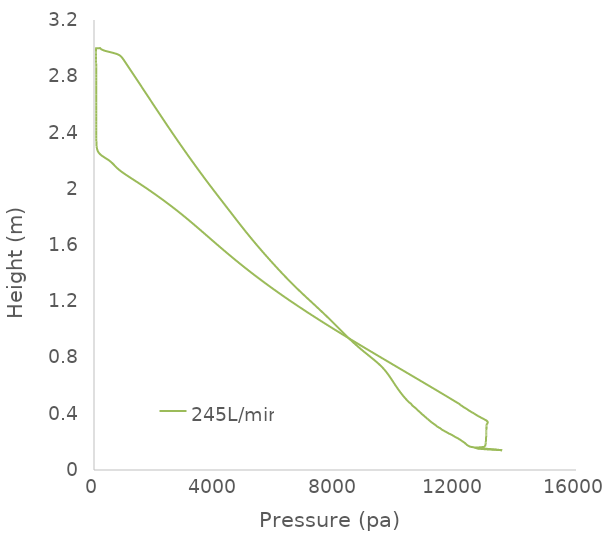
| Category | 245L/min |
|---|---|
| 13547.5 | 0.14 |
| 13414.4 | 0.144 |
| 13353.0 | 0.145 |
| 13295.0 | 0.146 |
| 13213.6 | 0.148 |
| 13187.0 | 0.148 |
| 13053.4 | 0.15 |
| 12757.8 | 0.155 |
| 12636.1 | 0.16 |
| 12604.9 | 0.161 |
| 12556.3 | 0.163 |
| 12500.2 | 0.165 |
| 12489.1 | 0.165 |
| 12440.3 | 0.171 |
| 12428.9 | 0.172 |
| 12397.9 | 0.176 |
| 12372.7 | 0.179 |
| 12365.8 | 0.181 |
| 12364.8 | 0.181 |
| 12363.4 | 0.181 |
| 12361.2 | 0.182 |
| 12357.9 | 0.182 |
| 12354.2 | 0.183 |
| 12346.4 | 0.185 |
| 12313.6 | 0.192 |
| 12302.8 | 0.194 |
| 12254.5 | 0.2 |
| 12253.1 | 0.201 |
| 12250.0 | 0.201 |
| 12248.1 | 0.201 |
| 12246.0 | 0.202 |
| 12243.4 | 0.202 |
| 12171.5 | 0.213 |
| 12168.9 | 0.213 |
| 12165.6 | 0.214 |
| 12161.5 | 0.214 |
| 12158.4 | 0.215 |
| 12086.9 | 0.224 |
| 12082.8 | 0.225 |
| 12079.6 | 0.225 |
| 12074.5 | 0.226 |
| 12065.8 | 0.227 |
| 12043.0 | 0.229 |
| 12036.1 | 0.23 |
| 11975.5 | 0.237 |
| 11961.4 | 0.239 |
| 11937.6 | 0.242 |
| 11881.0 | 0.249 |
| 11879.7 | 0.25 |
| 11874.6 | 0.25 |
| 11864.5 | 0.251 |
| 11864.1 | 0.251 |
| 11855.6 | 0.252 |
| 11854.8 | 0.252 |
| 11854.5 | 0.252 |
| 11787.1 | 0.259 |
| 11784.0 | 0.259 |
| 11734.8 | 0.265 |
| 11731.2 | 0.265 |
| 11727.2 | 0.266 |
| 11725.5 | 0.266 |
| 11668.2 | 0.273 |
| 11655.8 | 0.274 |
| 11655.7 | 0.274 |
| 11654.7 | 0.275 |
| 11649.2 | 0.275 |
| 11648.6 | 0.275 |
| 11617.5 | 0.279 |
| 11573.3 | 0.284 |
| 11566.2 | 0.285 |
| 11559.8 | 0.286 |
| 11554.8 | 0.286 |
| 11513.0 | 0.293 |
| 11496.3 | 0.296 |
| 11496.1 | 0.296 |
| 11495.5 | 0.296 |
| 11493.0 | 0.297 |
| 11486.1 | 0.298 |
| 11481.6 | 0.298 |
| 11447.3 | 0.302 |
| 11411.1 | 0.307 |
| 11404.6 | 0.308 |
| 11400.7 | 0.308 |
| 11398.9 | 0.308 |
| 11394.2 | 0.309 |
| 11382.8 | 0.311 |
| 11381.8 | 0.311 |
| 11375.2 | 0.312 |
| 11323.6 | 0.321 |
| 11317.1 | 0.322 |
| 11313.0 | 0.323 |
| 11272.1 | 0.329 |
| 11266.6 | 0.33 |
| 11258.6 | 0.331 |
| 11252.1 | 0.332 |
| 11249.3 | 0.333 |
| 11245.1 | 0.333 |
| 11243.8 | 0.333 |
| 11193.5 | 0.341 |
| 11190.3 | 0.342 |
| 11181.6 | 0.343 |
| 11173.3 | 0.345 |
| 11154.5 | 0.348 |
| 11154.5 | 0.348 |
| 11154.3 | 0.348 |
| 11154.0 | 0.348 |
| 11146.8 | 0.35 |
| 11139.7 | 0.351 |
| 11120.4 | 0.355 |
| 11119.5 | 0.355 |
| 11098.4 | 0.359 |
| 11090.4 | 0.36 |
| 11089.4 | 0.36 |
| 11086.3 | 0.361 |
| 11080.7 | 0.362 |
| 11075.2 | 0.363 |
| 11034.6 | 0.37 |
| 11030.5 | 0.371 |
| 11024.8 | 0.372 |
| 11012.7 | 0.374 |
| 10988.7 | 0.379 |
| 10984.2 | 0.38 |
| 10976.5 | 0.381 |
| 10940.7 | 0.388 |
| 10940.2 | 0.388 |
| 10934.9 | 0.389 |
| 10932.9 | 0.389 |
| 10930.7 | 0.39 |
| 10920.6 | 0.392 |
| 10908.5 | 0.394 |
| 10880.6 | 0.398 |
| 10872.2 | 0.401 |
| 10871.3 | 0.401 |
| 10870.6 | 0.401 |
| 10822.3 | 0.411 |
| 10819.4 | 0.412 |
| 10818.3 | 0.412 |
| 10813.2 | 0.413 |
| 10812.8 | 0.413 |
| 10811.9 | 0.413 |
| 10783.3 | 0.418 |
| 10752.2 | 0.423 |
| 10750.9 | 0.424 |
| 10747.9 | 0.424 |
| 10746.1 | 0.425 |
| 10710.7 | 0.433 |
| 10695.1 | 0.436 |
| 10693.9 | 0.437 |
| 10690.3 | 0.437 |
| 10660.9 | 0.442 |
| 10632.6 | 0.447 |
| 10632.0 | 0.447 |
| 10631.7 | 0.447 |
| 10630.0 | 0.448 |
| 10627.9 | 0.448 |
| 10626.4 | 0.448 |
| 10622.0 | 0.449 |
| 10615.8 | 0.45 |
| 10579.6 | 0.456 |
| 10577.4 | 0.457 |
| 10575.2 | 0.457 |
| 10561.9 | 0.46 |
| 10543.5 | 0.465 |
| 10543.1 | 0.465 |
| 10529.8 | 0.47 |
| 10529.6 | 0.47 |
| 10529.4 | 0.47 |
| 10529.3 | 0.47 |
| 10466.2 | 0.48 |
| 10416.4 | 0.491 |
| 10369.6 | 0.501 |
| 10326.0 | 0.511 |
| 10284.3 | 0.522 |
| 10243.8 | 0.532 |
| 10206.1 | 0.542 |
| 10169.3 | 0.553 |
| 10133.5 | 0.563 |
| 10098.7 | 0.574 |
| 10064.8 | 0.584 |
| 10031.8 | 0.594 |
| 9999.28 | 0.605 |
| 9967.27 | 0.615 |
| 9935.43 | 0.625 |
| 9903.63 | 0.636 |
| 9871.8 | 0.646 |
| 9839.4 | 0.656 |
| 9806.45 | 0.667 |
| 9772.45 | 0.677 |
| 9737.07 | 0.687 |
| 9700.24 | 0.698 |
| 9660.42 | 0.708 |
| 9618.88 | 0.718 |
| 9574.9 | 0.729 |
| 9527.21 | 0.739 |
| 9476.91 | 0.75 |
| 9424.13 | 0.76 |
| 9369.03 | 0.77 |
| 9311.71 | 0.781 |
| 9252.79 | 0.791 |
| 9193.19 | 0.801 |
| 9133.22 | 0.812 |
| 9073.15 | 0.822 |
| 9013.35 | 0.832 |
| 8954.16 | 0.843 |
| 8895.81 | 0.853 |
| 8838.42 | 0.863 |
| 8782.17 | 0.874 |
| 8726.7 | 0.884 |
| 8671.78 | 0.894 |
| 8618.24 | 0.905 |
| 8566.13 | 0.915 |
| 8514.53 | 0.926 |
| 8463.25 | 0.936 |
| 8412.74 | 0.946 |
| 8363.07 | 0.957 |
| 8314.49 | 0.967 |
| 8266.1 | 0.977 |
| 8217.42 | 0.988 |
| 8169.35 | 0.998 |
| 8121.76 | 1.008 |
| 8073.94 | 1.019 |
| 8025.65 | 1.029 |
| 7977.75 | 1.039 |
| 7929.41 | 1.05 |
| 7880.61 | 1.06 |
| 7831.87 | 1.07 |
| 7782.49 | 1.081 |
| 7732.23 | 1.091 |
| 7682.13 | 1.102 |
| 7631.61 | 1.112 |
| 7580.31 | 1.122 |
| 7529.04 | 1.133 |
| 7477.49 | 1.143 |
| 7425.57 | 1.153 |
| 7373.7 | 1.164 |
| 7321.92 | 1.174 |
| 7269.42 | 1.184 |
| 7217.39 | 1.195 |
| 7165.34 | 1.205 |
| 7112.44 | 1.215 |
| 7060.01 | 1.226 |
| 7008.47 | 1.236 |
| 6956.96 | 1.246 |
| 6905.59 | 1.257 |
| 6854.97 | 1.267 |
| 6804.42 | 1.278 |
| 6754.0 | 1.288 |
| 6704.6 | 1.298 |
| 6655.33 | 1.309 |
| 6606.24 | 1.319 |
| 6558.07 | 1.329 |
| 6510.33 | 1.34 |
| 6462.9 | 1.35 |
| 6415.62 | 1.36 |
| 6368.86 | 1.371 |
| 6322.64 | 1.381 |
| 6276.65 | 1.391 |
| 6231.05 | 1.402 |
| 6185.83 | 1.412 |
| 6140.66 | 1.422 |
| 6095.71 | 1.433 |
| 6051.27 | 1.443 |
| 6007.09 | 1.454 |
| 5963.05 | 1.464 |
| 5919.13 | 1.474 |
| 5875.49 | 1.485 |
| 5832.1 | 1.495 |
| 5788.92 | 1.505 |
| 5745.82 | 1.516 |
| 5702.85 | 1.526 |
| 5660.18 | 1.536 |
| 5617.95 | 1.547 |
| 5575.78 | 1.557 |
| 5533.79 | 1.567 |
| 5492.43 | 1.578 |
| 5450.86 | 1.588 |
| 5409.69 | 1.598 |
| 5369.04 | 1.609 |
| 5328.25 | 1.619 |
| 5287.98 | 1.63 |
| 5247.91 | 1.64 |
| 5207.91 | 1.65 |
| 5168.32 | 1.661 |
| 5128.78 | 1.671 |
| 5089.33 | 1.681 |
| 5050.22 | 1.692 |
| 5011.4 | 1.702 |
| 4971.1 | 1.713 |
| 4928.83 | 1.724 |
| 4885.3 | 1.736 |
| 4842.49 | 1.748 |
| 4802.37 | 1.759 |
| 4764.92 | 1.769 |
| 4727.32 | 1.779 |
| 4689.94 | 1.79 |
| 4652.73 | 1.8 |
| 4615.33 | 1.81 |
| 4577.98 | 1.821 |
| 4540.62 | 1.831 |
| 4503.17 | 1.842 |
| 4465.77 | 1.852 |
| 4428.42 | 1.862 |
| 4391.06 | 1.873 |
| 4353.84 | 1.883 |
| 4316.57 | 1.893 |
| 4279.14 | 1.904 |
| 4241.85 | 1.914 |
| 4204.44 | 1.924 |
| 4167.01 | 1.935 |
| 4129.82 | 1.945 |
| 4092.73 | 1.955 |
| 4055.58 | 1.966 |
| 4018.4 | 1.976 |
| 3981.47 | 1.986 |
| 3944.69 | 1.997 |
| 3907.88 | 2.007 |
| 3871.16 | 2.018 |
| 3834.61 | 2.028 |
| 3798.2 | 2.038 |
| 3762.03 | 2.049 |
| 3725.74 | 2.059 |
| 3689.47 | 2.069 |
| 3653.41 | 2.08 |
| 3617.54 | 2.09 |
| 3581.92 | 2.1 |
| 3546.3 | 2.111 |
| 3510.7 | 2.121 |
| 3475.16 | 2.131 |
| 3439.75 | 2.142 |
| 3404.54 | 2.152 |
| 3369.53 | 2.162 |
| 3334.63 | 2.173 |
| 3299.8 | 2.183 |
| 3265.02 | 2.194 |
| 3230.21 | 2.204 |
| 3195.51 | 2.214 |
| 3161.0 | 2.225 |
| 3126.67 | 2.235 |
| 3092.5 | 2.245 |
| 3058.35 | 2.256 |
| 3024.28 | 2.266 |
| 2990.28 | 2.276 |
| 2956.38 | 2.287 |
| 2922.59 | 2.297 |
| 2888.78 | 2.307 |
| 2855.09 | 2.318 |
| 2821.51 | 2.328 |
| 2788.05 | 2.338 |
| 2754.73 | 2.349 |
| 2721.5 | 2.359 |
| 2688.26 | 2.37 |
| 2655.07 | 2.38 |
| 2622.03 | 2.39 |
| 2589.1 | 2.401 |
| 2556.25 | 2.411 |
| 2523.49 | 2.421 |
| 2490.78 | 2.432 |
| 2458.1 | 2.442 |
| 2425.51 | 2.452 |
| 2392.97 | 2.463 |
| 2360.49 | 2.473 |
| 2328.09 | 2.483 |
| 2295.78 | 2.494 |
| 2263.48 | 2.504 |
| 2231.2 | 2.514 |
| 2199.0 | 2.525 |
| 2166.89 | 2.535 |
| 2134.77 | 2.546 |
| 2102.65 | 2.556 |
| 2070.59 | 2.566 |
| 2038.57 | 2.577 |
| 2006.58 | 2.587 |
| 1974.61 | 2.597 |
| 1942.65 | 2.608 |
| 1910.69 | 2.618 |
| 1878.71 | 2.628 |
| 1846.77 | 2.639 |
| 1814.82 | 2.649 |
| 1782.84 | 2.659 |
| 1750.91 | 2.67 |
| 1719.0 | 2.68 |
| 1687.1 | 2.69 |
| 1655.21 | 2.701 |
| 1623.28 | 2.711 |
| 1591.33 | 2.722 |
| 1559.38 | 2.732 |
| 1527.43 | 2.742 |
| 1495.47 | 2.753 |
| 1463.47 | 2.763 |
| 1431.42 | 2.773 |
| 1399.36 | 2.784 |
| 1367.29 | 2.794 |
| 1335.21 | 2.804 |
| 1303.12 | 2.815 |
| 1271.02 | 2.825 |
| 1238.86 | 2.835 |
| 1206.66 | 2.846 |
| 1174.44 | 2.856 |
| 1142.18 | 2.866 |
| 1109.86 | 2.877 |
| 1077.52 | 2.887 |
| 1045.12 | 2.898 |
| 1012.57 | 2.908 |
| 979.656 | 2.918 |
| 945.296 | 2.929 |
| 905.225 | 2.939 |
| 846.147 | 2.949 |
| 740.371 | 2.96 |
| 562.962 | 2.97 |
| 562.962 | 2.97 |
| 378.116 | 2.98 |
| 257.618 | 2.99 |
| 201.285 | 3 |
| 201.278 | 3 |
| 201.116 | 3 |
| 181.213 | 3 |
| 140.723 | 3 |
| 123.224 | 3 |
| 117.063 | 3 |
| 115.191 | 3 |
| 112.268 | 3 |
| 111.33 | 3 |
| 110.616 | 3 |
| 109.6 | 3 |
| 109.366 | 3 |
| 77.283 | 3 |
| 73.8377 | 3 |
| 73.3734 | 3 |
| 73.8986 | 3 |
| 74.4617 | 3 |
| 66.7462 | 3 |
| 66.7471 | 3 |
| 66.7667 | 3 |
| 66.7675 | 3 |
| 66.8082 | 3 |
| 66.8282 | 3 |
| 66.8282 | 3 |
| 66.8277 | 2.997 |
| 66.8044 | 2.988 |
| 66.7612 | 2.978 |
| 66.7984 | 2.969 |
| 67.1744 | 2.959 |
| 68.0473 | 2.95 |
| 68.9822 | 2.94 |
| 69.5549 | 2.93 |
| 69.9523 | 2.92 |
| 70.2553 | 2.91 |
| 70.4895 | 2.9 |
| 70.6645 | 2.89 |
| 70.8366 | 2.88 |
| 70.9951 | 2.87 |
| 71.1255 | 2.86 |
| 71.2571 | 2.85 |
| 71.5136 | 2.83 |
| 71.7687 | 2.811 |
| 72.0508 | 2.791 |
| 72.3596 | 2.771 |
| 72.6912 | 2.752 |
| 73.0553 | 2.732 |
| 73.4326 | 2.712 |
| 73.8242 | 2.692 |
| 74.2264 | 2.673 |
| 74.6071 | 2.653 |
| 74.9753 | 2.633 |
| 75.3392 | 2.614 |
| 75.6787 | 2.594 |
| 75.9956 | 2.574 |
| 76.304 | 2.555 |
| 76.5924 | 2.535 |
| 76.8501 | 2.515 |
| 77.0841 | 2.495 |
| 77.2866 | 2.476 |
| 77.4412 | 2.456 |
| 77.5289 | 2.436 |
| 77.5469 | 2.417 |
| 77.5498 | 2.397 |
| 77.6405 | 2.377 |
| 77.9773 | 2.358 |
| 78.9309 | 2.338 |
| 81.6062 | 2.318 |
| 88.8163 | 2.298 |
| 106.806 | 2.279 |
| 148.46 | 2.259 |
| 233.435 | 2.239 |
| 368.794 | 2.22 |
| 508.475 | 2.2 |
| 616.586 | 2.18 |
| 705.219 | 2.16 |
| 801.932 | 2.14 |
| 918.61 | 2.12 |
| 1051.24 | 2.101 |
| 1191.97 | 2.081 |
| 1335.35 | 2.061 |
| 1478.41 | 2.041 |
| 1619.27 | 2.021 |
| 1756.96 | 2.001 |
| 1891.66 | 1.981 |
| 2024.0 | 1.961 |
| 2154.19 | 1.941 |
| 2282.2 | 1.922 |
| 2407.95 | 1.902 |
| 2531.35 | 1.882 |
| 2652.28 | 1.862 |
| 2770.83 | 1.842 |
| 2887.16 | 1.822 |
| 3001.32 | 1.802 |
| 3113.58 | 1.782 |
| 3224.37 | 1.763 |
| 3333.85 | 1.743 |
| 3442.33 | 1.723 |
| 3549.9 | 1.703 |
| 3657.05 | 1.683 |
| 3764.01 | 1.663 |
| 3870.65 | 1.643 |
| 3977.67 | 1.623 |
| 4084.99 | 1.603 |
| 4192.79 | 1.584 |
| 4301.65 | 1.564 |
| 4411.42 | 1.544 |
| 4522.1 | 1.524 |
| 4634.01 | 1.504 |
| 4747.25 | 1.484 |
| 4861.86 | 1.464 |
| 4977.88 | 1.444 |
| 5095.42 | 1.424 |
| 5214.45 | 1.405 |
| 5334.97 | 1.385 |
| 5334.97 | 1.385 |
| 5457.32 | 1.365 |
| 5581.53 | 1.345 |
| 5707.22 | 1.325 |
| 5834.18 | 1.305 |
| 5962.86 | 1.285 |
| 6093.41 | 1.265 |
| 6225.47 | 1.246 |
| 6358.78 | 1.226 |
| 6493.57 | 1.206 |
| 6630.7 | 1.186 |
| 6769.46 | 1.166 |
| 6909.22 | 1.146 |
| 7050.13 | 1.126 |
| 7192.99 | 1.106 |
| 7337.48 | 1.086 |
| 7482.24 | 1.067 |
| 7628.7 | 1.047 |
| 7777.42 | 1.027 |
| 7926.05 | 1.007 |
| 8075.84 | 0.987 |
| 8227.09 | 0.967 |
| 8379.48 | 0.947 |
| 8532.25 | 0.927 |
| 8686.01 | 0.907 |
| 8840.67 | 0.888 |
| 8995.2 | 0.868 |
| 9150.92 | 0.848 |
| 9306.83 | 0.828 |
| 9463.39 | 0.808 |
| 9620.54 | 0.788 |
| 9777.74 | 0.768 |
| 9935.08 | 0.748 |
| 10092.4 | 0.729 |
| 10250.3 | 0.709 |
| 10407.7 | 0.689 |
| 10565.1 | 0.669 |
| 10722.8 | 0.649 |
| 10879.9 | 0.629 |
| 11037.1 | 0.609 |
| 11194.3 | 0.589 |
| 11350.8 | 0.569 |
| 11506.5 | 0.55 |
| 11662.1 | 0.53 |
| 11816.9 | 0.51 |
| 11969.7 | 0.49 |
| 12125.6 | 0.47 |
| 12125.7 | 0.47 |
| 12125.9 | 0.47 |
| 12129.0 | 0.469 |
| 12129.6 | 0.469 |
| 12130.5 | 0.469 |
| 12131.2 | 0.468 |
| 12136.6 | 0.467 |
| 12137.2 | 0.467 |
| 12137.3 | 0.467 |
| 12137.7 | 0.467 |
| 12148.1 | 0.466 |
| 12148.1 | 0.466 |
| 12149.6 | 0.465 |
| 12151.0 | 0.465 |
| 12157.0 | 0.464 |
| 12169.4 | 0.462 |
| 12173.5 | 0.461 |
| 12177.2 | 0.46 |
| 12177.5 | 0.46 |
| 12190.7 | 0.459 |
| 12193.6 | 0.459 |
| 12202.6 | 0.457 |
| 12204.0 | 0.457 |
| 12204.5 | 0.457 |
| 12206.4 | 0.457 |
| 12220.1 | 0.455 |
| 12242.9 | 0.451 |
| 12258.3 | 0.449 |
| 12260.0 | 0.448 |
| 12264.5 | 0.448 |
| 12285.7 | 0.445 |
| 12299.9 | 0.443 |
| 12306.0 | 0.442 |
| 12309.0 | 0.442 |
| 12317.4 | 0.441 |
| 12322.0 | 0.44 |
| 12326.3 | 0.44 |
| 12365.0 | 0.435 |
| 12368.5 | 0.435 |
| 12399.6 | 0.43 |
| 12403.6 | 0.429 |
| 12404.2 | 0.429 |
| 12405.5 | 0.429 |
| 12413.3 | 0.428 |
| 12416.8 | 0.427 |
| 12420.9 | 0.427 |
| 12427.9 | 0.426 |
| 12445.7 | 0.423 |
| 12493.1 | 0.417 |
| 12502.4 | 0.416 |
| 12507.6 | 0.415 |
| 12515.3 | 0.414 |
| 12523.4 | 0.413 |
| 12550.8 | 0.41 |
| 12555.4 | 0.409 |
| 12578.6 | 0.406 |
| 12584.1 | 0.406 |
| 12589.5 | 0.405 |
| 12591.5 | 0.405 |
| 12591.7 | 0.405 |
| 12593.8 | 0.405 |
| 12594.0 | 0.405 |
| 12597.0 | 0.404 |
| 12618.3 | 0.401 |
| 12657.8 | 0.396 |
| 12664.1 | 0.395 |
| 12668.7 | 0.395 |
| 12671.4 | 0.394 |
| 12739.7 | 0.385 |
| 12744.6 | 0.385 |
| 12749.8 | 0.384 |
| 12770.7 | 0.382 |
| 12785.1 | 0.38 |
| 12809.2 | 0.377 |
| 12835.9 | 0.374 |
| 12843.9 | 0.373 |
| 12859.5 | 0.371 |
| 12877.4 | 0.369 |
| 12903.0 | 0.366 |
| 12911.4 | 0.365 |
| 12923.4 | 0.364 |
| 12932.9 | 0.363 |
| 12971.5 | 0.358 |
| 12981.1 | 0.357 |
| 13004.0 | 0.355 |
| 13019.3 | 0.353 |
| 13028.1 | 0.351 |
| 13031.2 | 0.351 |
| 13042.2 | 0.348 |
| 13046.2 | 0.347 |
| 13053.2 | 0.346 |
| 13066.4 | 0.343 |
| 13068.3 | 0.342 |
| 13070.1 | 0.342 |
| 13072.0 | 0.341 |
| 13073.5 | 0.34 |
| 13073.5 | 0.34 |
| 13072.0 | 0.338 |
| 13070.6 | 0.337 |
| 13070.2 | 0.337 |
| 13069.7 | 0.335 |
| 13067.5 | 0.334 |
| 13067.2 | 0.334 |
| 13062.9 | 0.333 |
| 13056.3 | 0.329 |
| 13054.7 | 0.329 |
| 13046.0 | 0.327 |
| 13039.6 | 0.325 |
| 13037.5 | 0.325 |
| 13033.1 | 0.323 |
| 13030.7 | 0.322 |
| 13029.5 | 0.321 |
| 13027.8 | 0.32 |
| 13027.9 | 0.318 |
| 13028.0 | 0.316 |
| 13027.3 | 0.315 |
| 13026.8 | 0.315 |
| 13026.8 | 0.314 |
| 13026.8 | 0.313 |
| 13026.7 | 0.311 |
| 13026.4 | 0.309 |
| 13026.3 | 0.307 |
| 13026.2 | 0.305 |
| 13026.2 | 0.304 |
| 13026.1 | 0.302 |
| 13026.0 | 0.301 |
| 13026.0 | 0.301 |
| 13025.8 | 0.298 |
| 13025.7 | 0.297 |
| 13025.6 | 0.296 |
| 13025.5 | 0.294 |
| 13025.2 | 0.291 |
| 13025.2 | 0.291 |
| 13025.2 | 0.291 |
| 13025.1 | 0.29 |
| 13025.1 | 0.29 |
| 13024.9 | 0.287 |
| 13024.8 | 0.287 |
| 13024.7 | 0.286 |
| 13024.4 | 0.284 |
| 13024.3 | 0.282 |
| 13024.2 | 0.282 |
| 13024.0 | 0.28 |
| 13023.8 | 0.278 |
| 13023.7 | 0.278 |
| 13023.3 | 0.274 |
| 13023.2 | 0.274 |
| 13023.0 | 0.272 |
| 13023.0 | 0.271 |
| 13022.9 | 0.27 |
| 13022.6 | 0.268 |
| 13022.5 | 0.266 |
| 13022.0 | 0.262 |
| 13021.9 | 0.261 |
| 13021.8 | 0.261 |
| 13021.8 | 0.261 |
| 13021.7 | 0.26 |
| 13021.5 | 0.259 |
| 13021.3 | 0.258 |
| 13020.9 | 0.256 |
| 13020.6 | 0.254 |
| 13020.4 | 0.252 |
| 13020.2 | 0.251 |
| 13020.1 | 0.251 |
| 13019.5 | 0.247 |
| 13019.4 | 0.246 |
| 13019.3 | 0.245 |
| 13018.9 | 0.242 |
| 13018.5 | 0.24 |
| 13018.2 | 0.239 |
| 13017.7 | 0.237 |
| 13017.4 | 0.235 |
| 13017.1 | 0.234 |
| 13016.8 | 0.233 |
| 13016.7 | 0.233 |
| 13016.3 | 0.232 |
| 13015.4 | 0.228 |
| 13015.1 | 0.227 |
| 13014.9 | 0.226 |
| 13014.3 | 0.224 |
| 13014.1 | 0.223 |
| 13013.6 | 0.221 |
| 13013.2 | 0.22 |
| 13012.1 | 0.216 |
| 13012.1 | 0.216 |
| 13011.9 | 0.215 |
| 13011.6 | 0.214 |
| 13011.4 | 0.213 |
| 13010.7 | 0.211 |
| 13009.9 | 0.209 |
| 13009.7 | 0.208 |
| 13009.4 | 0.207 |
| 13008.9 | 0.206 |
| 13008.8 | 0.206 |
| 13007.2 | 0.202 |
| 13006.9 | 0.201 |
| 13005.9 | 0.198 |
| 13005.6 | 0.198 |
| 13004.7 | 0.195 |
| 13004.6 | 0.195 |
| 13001.6 | 0.19 |
| 13001.6 | 0.19 |
| 13001.3 | 0.189 |
| 13001.0 | 0.189 |
| 13000.9 | 0.189 |
| 13000.6 | 0.188 |
| 13000.5 | 0.188 |
| 12996.9 | 0.183 |
| 12994.7 | 0.181 |
| 12994.2 | 0.18 |
| 12991.8 | 0.178 |
| 12991.8 | 0.178 |
| 12991.6 | 0.177 |
| 12991.3 | 0.177 |
| 12987.1 | 0.174 |
| 12984.2 | 0.171 |
| 12984.1 | 0.171 |
| 12969.3 | 0.168 |
| 12968.8 | 0.168 |
| 12961.9 | 0.166 |
| 12961.5 | 0.165 |
| 12958.6 | 0.165 |
| 12951.7 | 0.165 |
| 12903.3 | 0.163 |
| 12669.2 | 0.159 |
| 12670.7 | 0.158 |
| 12671.9 | 0.158 |
| 12728.3 | 0.153 |
| 12738.2 | 0.152 |
| 12759.3 | 0.152 |
| 12771.6 | 0.151 |
| 13028.0 | 0.147 |
| 13159.0 | 0.145 |
| 13163.0 | 0.145 |
| 13356.2 | 0.143 |
| 13480.9 | 0.142 |
| 13547.5 | 0.14 |